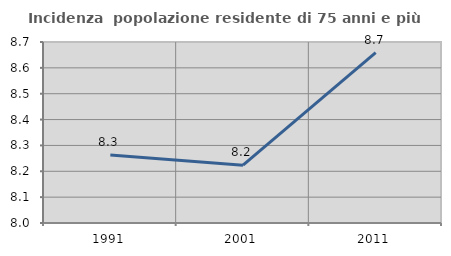
| Category | Incidenza  popolazione residente di 75 anni e più |
|---|---|
| 1991.0 | 8.263 |
| 2001.0 | 8.224 |
| 2011.0 | 8.659 |